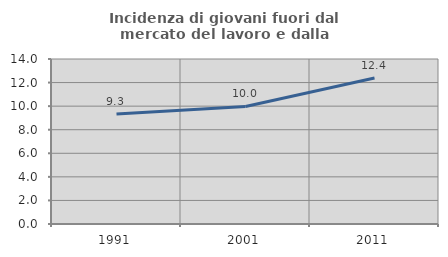
| Category | Incidenza di giovani fuori dal mercato del lavoro e dalla formazione  |
|---|---|
| 1991.0 | 9.327 |
| 2001.0 | 9.971 |
| 2011.0 | 12.388 |